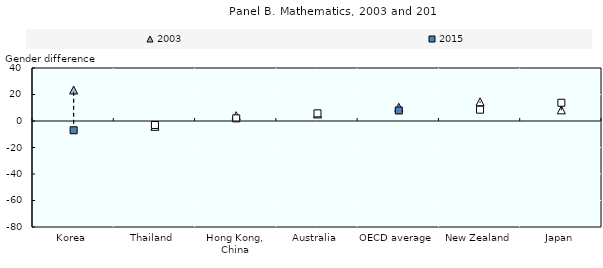
| Category | 2003 | 2015 |
|---|---|---|
| Korea | 23.406 | -6.99 |
| Thailand | -4 | -3 |
| Hong Kong, China | 4 | 2 |
| Australia | 5.342 | 5.776 |
| OECD average | 10.363 | 7.938 |
| New Zealand | 14.482 | 8.549 |
| Japan | 8.42 | 13.771 |